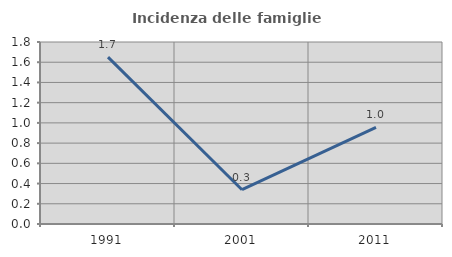
| Category | Incidenza delle famiglie numerose |
|---|---|
| 1991.0 | 1.65 |
| 2001.0 | 0.339 |
| 2011.0 | 0.955 |